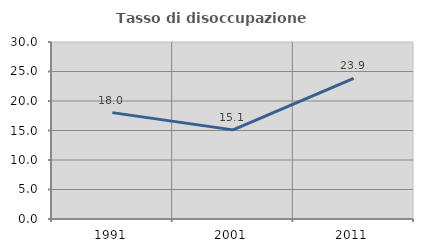
| Category | Tasso di disoccupazione giovanile  |
|---|---|
| 1991.0 | 18.03 |
| 2001.0 | 15.104 |
| 2011.0 | 23.853 |